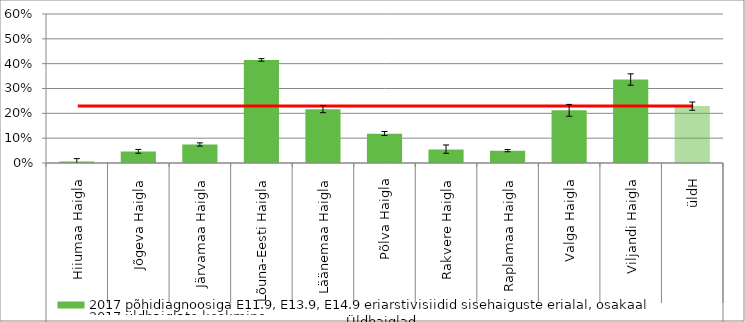
| Category | 2017 põhidiagnoosiga E11.9, E13.9, E14.9 eriarstivisiidid sisehaiguste erialal, osakaal |
|---|---|
| 0 | 0.006 |
| 1 | 0.047 |
| 2 | 0.074 |
| 3 | 0.415 |
| 4 | 0.217 |
| 5 | 0.118 |
| 6 | 0.055 |
| 7 | 0.05 |
| 8 | 0.212 |
| 9 | 0.336 |
| 10 | 0.229 |